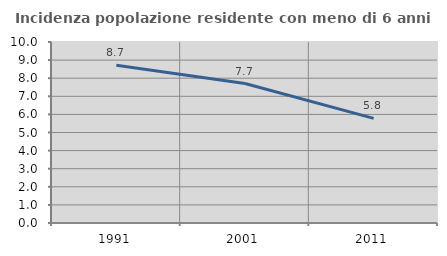
| Category | Incidenza popolazione residente con meno di 6 anni |
|---|---|
| 1991.0 | 8.711 |
| 2001.0 | 7.707 |
| 2011.0 | 5.779 |